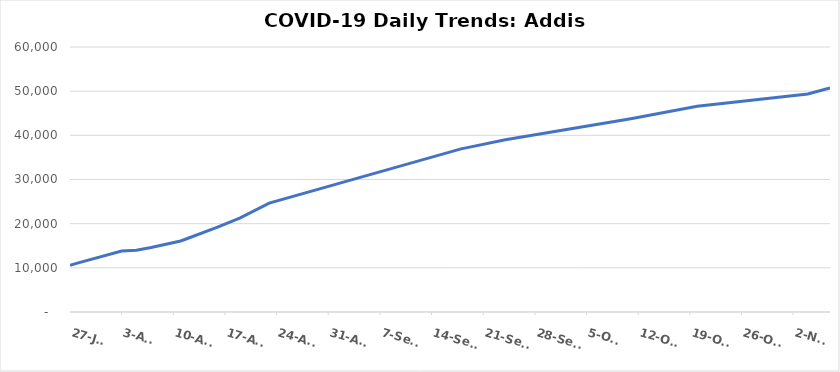
| Category | Addis Ababa |
|---|---|
| 2020-07-27 | 10583 |
| 2020-07-28 | 11076 |
| 2020-08-03 | 13826 |
| 2020-08-05 | 14005 |
| 2020-08-07 | 14607 |
| 2020-08-09 | 15352 |
| 2020-08-11 | 16086 |
| 2020-08-12 | 16698 |
| 2020-08-16 | 19207 |
| 2020-08-17 | 19881 |
| 2020-08-19 | 21266 |
| 2020-08-23 | 24659 |
| 2020-09-18 | 36939 |
| 2020-09-19 | 37278 |
| 2020-09-24 | 39012 |
| 2020-10-11 | 43749 |
| 2020-10-20 | 46570 |
| 2020-11-04 | 49377 |
| 2020-11-07 | 50749 |